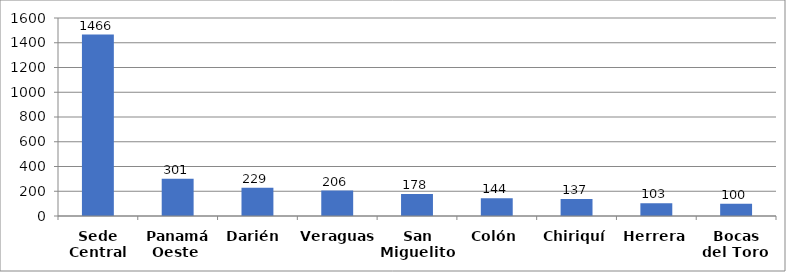
| Category | Series 0 |
|---|---|
| Sede Central | 1466 |
| Panamá Oeste  | 301 |
| Darién  | 229 |
| Veraguas | 206 |
| San Miguelito  | 178 |
| Colón | 144 |
| Chiriquí | 137 |
| Herrera | 103 |
| Bocas del Toro  | 100 |